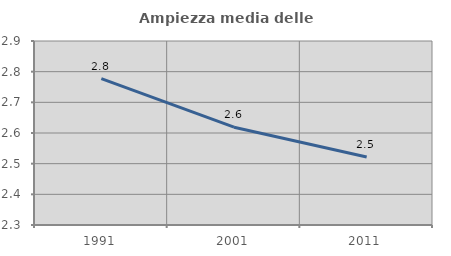
| Category | Ampiezza media delle famiglie |
|---|---|
| 1991.0 | 2.777 |
| 2001.0 | 2.619 |
| 2011.0 | 2.522 |